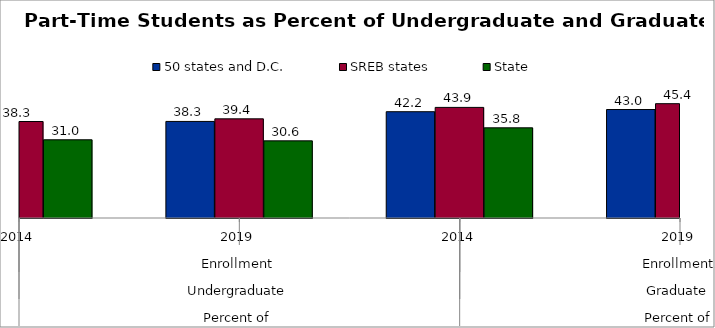
| Category | 50 states and D.C. | SREB states | State |
|---|---|---|---|
| 0 | 37.4 | 38.289 | 31.034 |
| 1 | 38.322 | 39.353 | 30.615 |
| 2 | 42.181 | 43.889 | 35.788 |
| 3 | 43.046 | 45.364 | 40.847 |